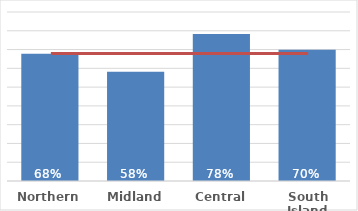
| Category | Māori |
|---|---|
| Northern | 0.678 |
| Midland | 0.582 |
| Central | 0.783 |
| South Island | 0.699 |